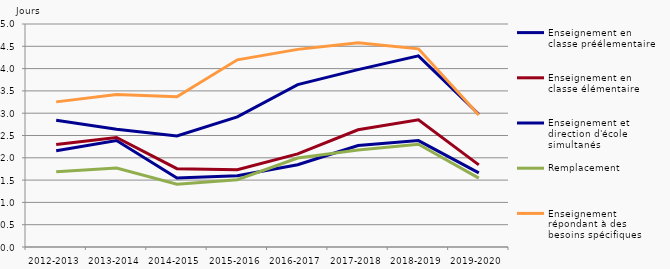
| Category | Enseignement en classe préélementaire | Enseignement en classe élémentaire | Enseignement et direction d'école simultanés | Remplacement | Enseignement répondant à des besoins spécifiques |
|---|---|---|---|---|---|
| 2012-2013 | 2.157 | 2.296 | 2.841 | 1.69 | 3.254 |
| 2013-2014 | 2.389 | 2.457 | 2.642 | 1.771 | 3.421 |
| 2014-2015 | 1.546 | 1.757 | 2.491 | 1.406 | 3.37 |
| 2015-2016 | 1.597 | 1.732 | 2.918 | 1.508 | 4.197 |
| 2016-2017 | 1.844 | 2.089 | 3.642 | 1.994 | 4.431 |
| 2017-2018 | 2.275 | 2.628 | 3.977 | 2.176 | 4.579 |
| 2018-2019 | 2.385 | 2.851 | 4.285 | 2.303 | 4.443 |
| 2019-2020 | 1.662 | 1.842 | 2.976 | 1.545 | 2.958 |